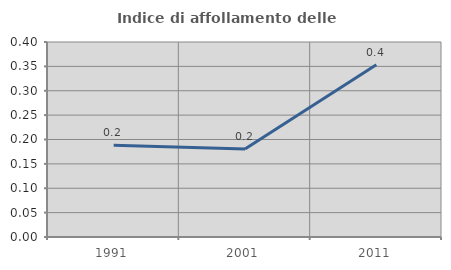
| Category | Indice di affollamento delle abitazioni  |
|---|---|
| 1991.0 | 0.188 |
| 2001.0 | 0.18 |
| 2011.0 | 0.353 |